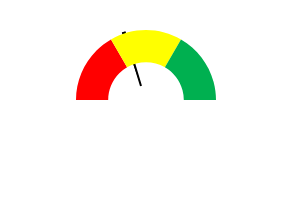
| Category | Series 1 |
|---|---|
| 0 | 24.524 |
| 1 | 1 |
| 2 | 100 |